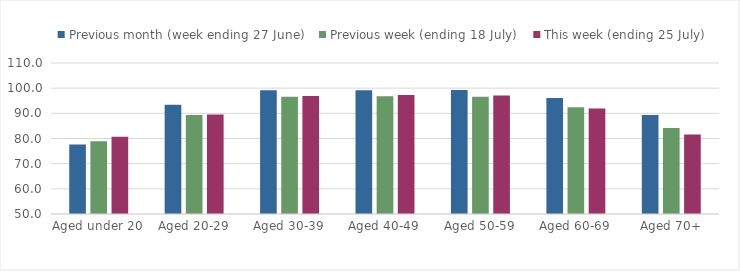
| Category | Previous month (week ending 27 June) | Previous week (ending 18 July) | This week (ending 25 July) |
|---|---|---|---|
| Aged under 20 | 77.634 | 78.94 | 80.662 |
| Aged 20-29 | 93.44 | 89.354 | 89.574 |
| Aged 30-39 | 99.191 | 96.61 | 96.856 |
| Aged 40-49 | 99.133 | 96.831 | 97.277 |
| Aged 50-59 | 99.245 | 96.635 | 97.084 |
| Aged 60-69 | 96.126 | 92.423 | 91.909 |
| Aged 70+ | 89.352 | 84.165 | 81.585 |